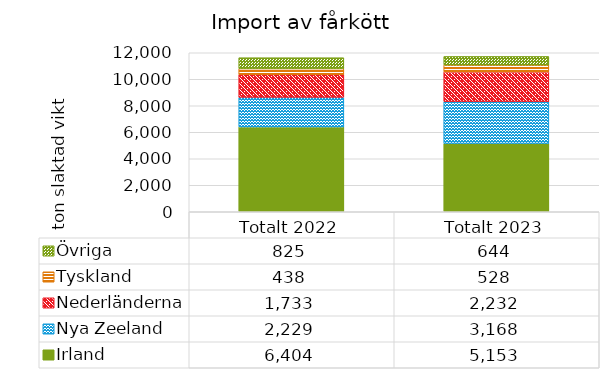
| Category | Irland | Nya Zeeland | Nederländerna | Tyskland | Övriga |
|---|---|---|---|---|---|
| Totalt 2022 | 6404 | 2229 | 1733 | 438.333 | 825 |
| Totalt 2023 | 5153 | 3168.333 | 2232 | 527.667 | 644 |